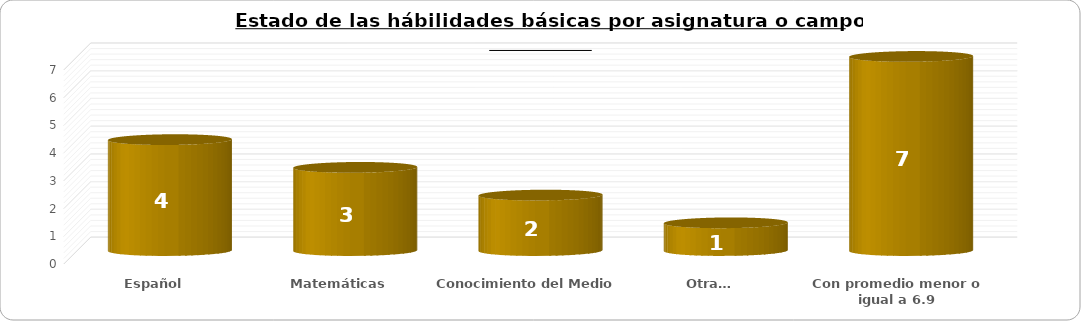
| Category | Requieren apoyo |
|---|---|
| Español | 4 |
| Matemáticas | 3 |
| Conocimiento del Medio  | 2 |
| Otra… | 1 |
| Con promedio menor o igual a 6.9 | 7 |